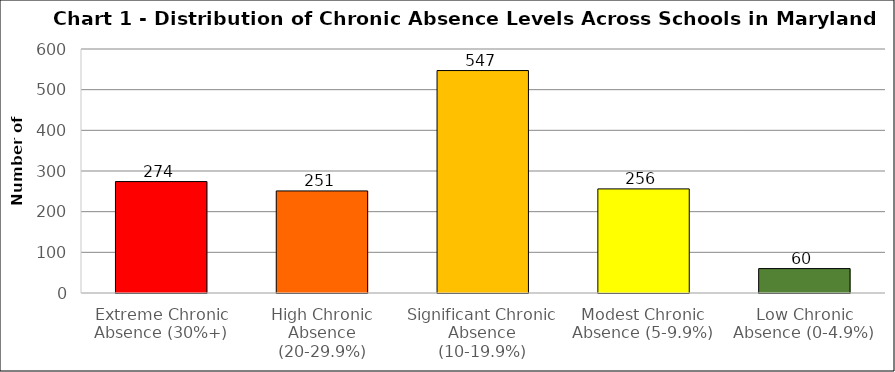
| Category | Series 0 |
|---|---|
| Extreme Chronic Absence (30%+) | 274 |
| High Chronic Absence (20-29.9%) | 251 |
| Significant Chronic Absence (10-19.9%) | 547 |
| Modest Chronic Absence (5-9.9%) | 256 |
| Low Chronic Absence (0-4.9%) | 60 |